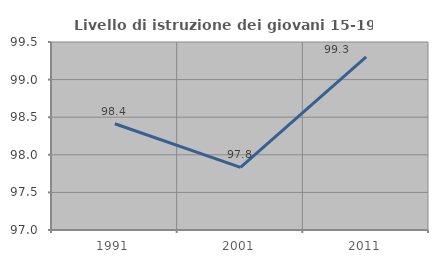
| Category | Livello di istruzione dei giovani 15-19 anni |
|---|---|
| 1991.0 | 98.413 |
| 2001.0 | 97.833 |
| 2011.0 | 99.301 |